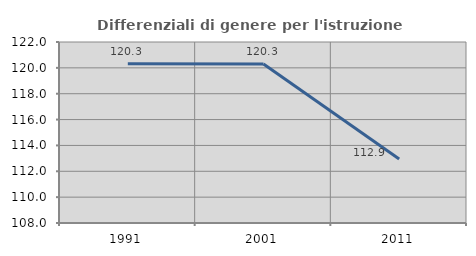
| Category | Differenziali di genere per l'istruzione superiore |
|---|---|
| 1991.0 | 120.318 |
| 2001.0 | 120.295 |
| 2011.0 | 112.943 |